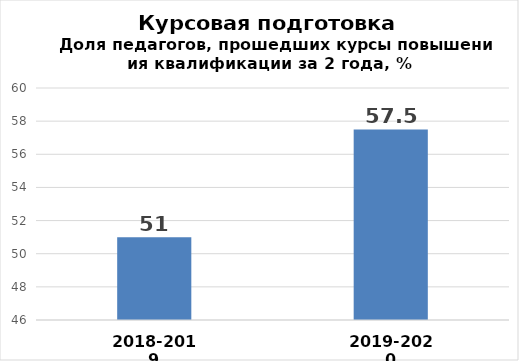
| Category | Series 0 |
|---|---|
| 2018-2019 | 51 |
| 2019-2020 | 57.5 |